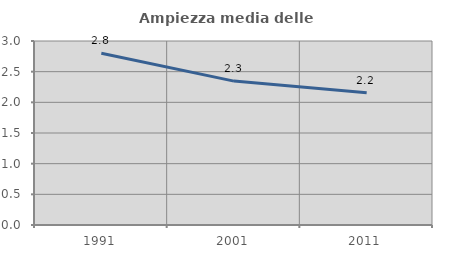
| Category | Ampiezza media delle famiglie |
|---|---|
| 1991.0 | 2.799 |
| 2001.0 | 2.346 |
| 2011.0 | 2.156 |